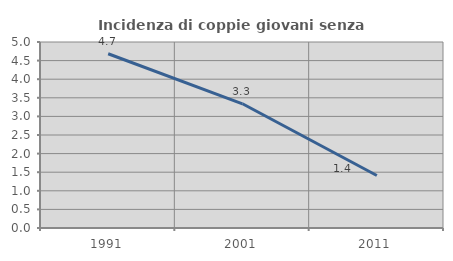
| Category | Incidenza di coppie giovani senza figli |
|---|---|
| 1991.0 | 4.684 |
| 2001.0 | 3.339 |
| 2011.0 | 1.411 |